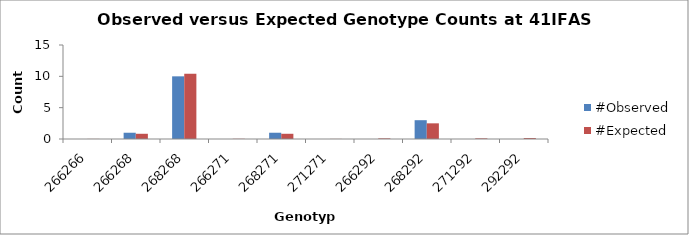
| Category | #Observed | #Expected |
|---|---|---|
| 266266.0 | 0 | 0.017 |
| 266268.0 | 1 | 0.833 |
| 268268.0 | 10 | 10.417 |
| 266271.0 | 0 | 0.033 |
| 268271.0 | 1 | 0.833 |
| 271271.0 | 0 | 0.017 |
| 266292.0 | 0 | 0.1 |
| 268292.0 | 3 | 2.5 |
| 271292.0 | 0 | 0.1 |
| 292292.0 | 0 | 0.15 |